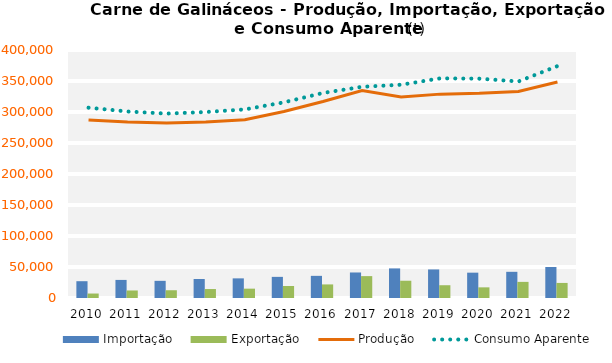
| Category | Importação | Exportação |
|---|---|---|
| 0 | 27102.048 | 7215.081 |
| 1 | 29164.863 | 12148.939 |
| 2 | 27686.647 | 12511.243 |
| 3 | 30601.398 | 14459.124 |
| 4 | 31665.726 | 15064.919 |
| 5 | 34086.885 | 19392.183 |
| 6 | 35719.477 | 21910.343 |
| 7 | 41169.724 | 35298.513 |
| 8 | 47733.583 | 27848.527 |
| 9 | 46052.744 | 20604.239 |
| 10 | 40857.56 | 17174.328 |
| 11 | 42236.469 | 25996.906 |
| 12 | 50045.265 | 24295.274 |